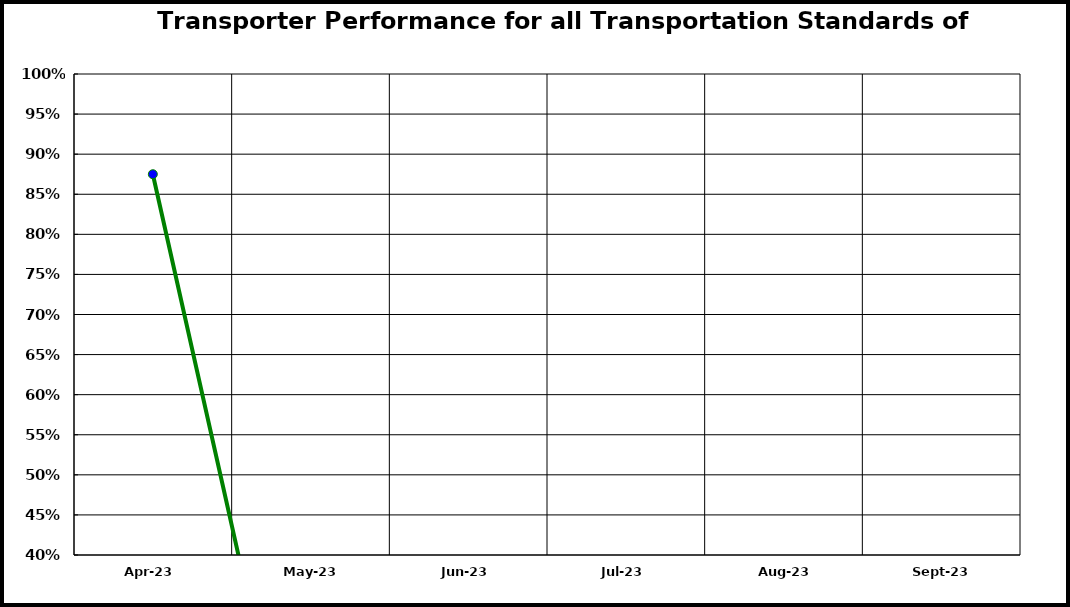
| Category | Performance |
|---|---|
| 2023-04-01 | 0.875 |
| 2023-05-01 | 0 |
| 2023-06-01 | 0 |
| 2023-07-01 | 0 |
| 2023-08-01 | 0 |
| 2023-09-01 | 0 |